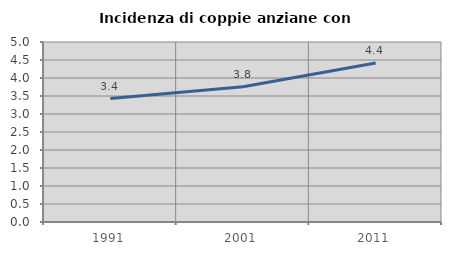
| Category | Incidenza di coppie anziane con figli |
|---|---|
| 1991.0 | 3.43 |
| 2001.0 | 3.757 |
| 2011.0 | 4.414 |